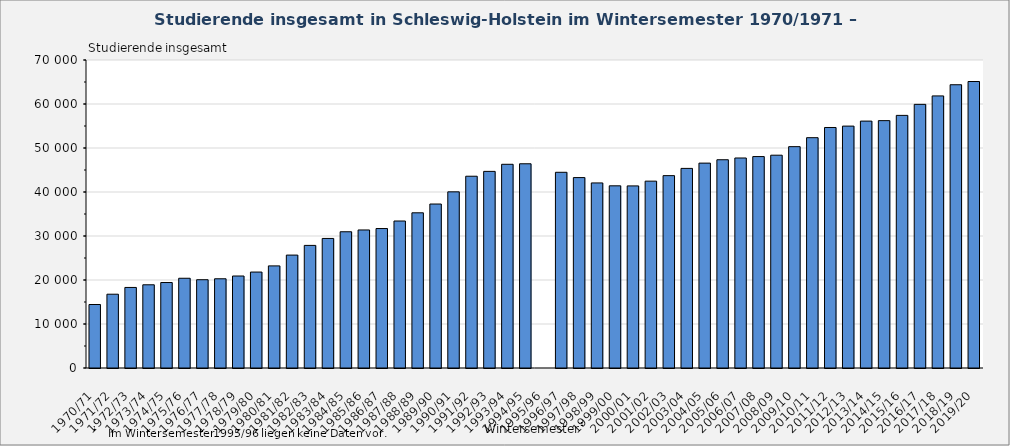
| Category | Studierende insgesamt |
|---|---|
| 1970/71 | 14430 |
| 1971/72 | 16771 |
| 1972/73 | 18307 |
| 1973/74 | 18913 |
| 1974/75 | 19425 |
| 1975/76 | 20396 |
| 1976/77 | 20064 |
| 1977/78 | 20277 |
| 1978/79 | 20908 |
| 1979/80 | 21805 |
| 1980/81 | 23208 |
| 1981/82 | 25661 |
| 1982/83 | 27864 |
| 1983/84 | 29443 |
| 1984/85 | 30964 |
| 1985/86 | 31372 |
| 1986/87 | 31697 |
| 1987/88 | 33407 |
| 1988/89 | 35272 |
| 1989/90 | 37266 |
| 1990/91 | 40036 |
| 1991/92 | 43584 |
| 1992/93 | 44686 |
| 1993/94 | 46297 |
| 1994/95 | 46414 |
| 1995/96 | 0 |
| 1996/97 | 44478 |
| 1997/98 | 43277 |
| 1998/99 | 42061 |
| 1999/00 | 41405 |
| 2000/01 | 41387 |
| 2001/02 | 42466 |
| 2002/03 | 43719 |
| 2003/04 | 45364 |
| 2004/05 | 46565 |
| 2005/06 | 47331 |
| 2006/07 | 47730 |
| 2007/08 | 48052 |
| 2008/09 | 48366 |
| 2009/10 | 50307 |
| 2010/11 | 52344 |
| 2011/12 | 54662 |
| 2012/13 | 54977 |
| 2013/14 | 56113 |
| 2014/15 | 56221 |
| 2015/16 | 57412 |
| 2016/17 | 59919 |
| 2017/18 | 61837 |
| 2018/19 | 64377 |
| 2019/20 | 65112 |